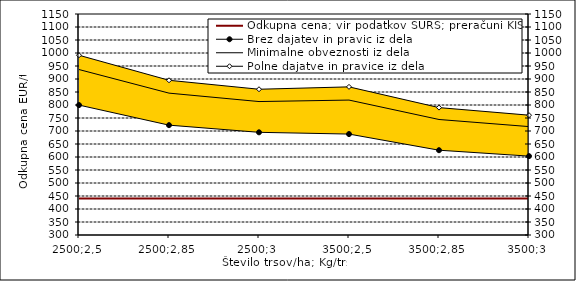
| Category | Odkupna cena; vir podatkov SURS; preračuni KIS |
|---|---|
| 2500;2,5 | 440 |
| 2500;2,85 | 440 |
| 2500;3 | 440 |
| 3500;2,5 | 440 |
| 3500;2,85 | 440 |
| 3500;3 | 440 |